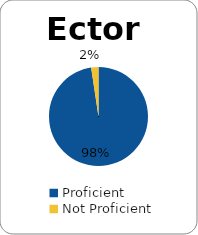
| Category | Series 0 |
|---|---|
| Proficient | 1 |
| Not Proficient | 0.024 |